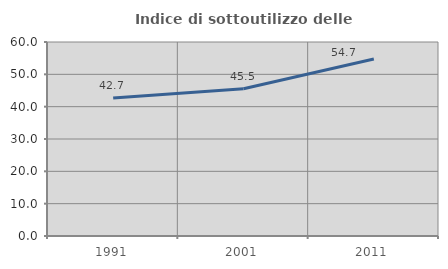
| Category | Indice di sottoutilizzo delle abitazioni  |
|---|---|
| 1991.0 | 42.672 |
| 2001.0 | 45.536 |
| 2011.0 | 54.741 |